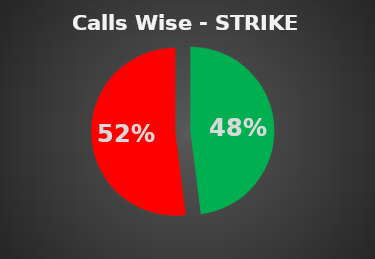
| Category | Series 0 |
|---|---|
| 0 | 0.48 |
| 1 | 0.52 |